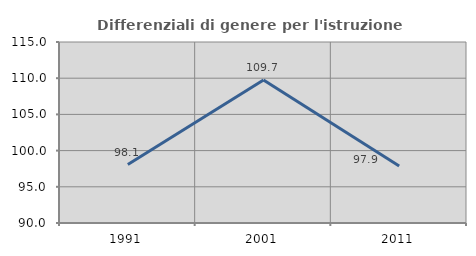
| Category | Differenziali di genere per l'istruzione superiore |
|---|---|
| 1991.0 | 98.069 |
| 2001.0 | 109.742 |
| 2011.0 | 97.864 |